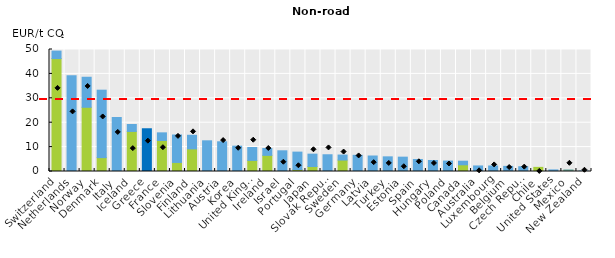
| Category | Average explicit carbon tax, 2018 | Average fuel excise tax, 2018 |
|---|---|---|
| Switzerland | 46.276 | 3.068 |
| Netherlands | 0 | 39.267 |
| Norway | 26.324 | 12.3 |
| Denmark | 5.682 | 27.645 |
| Italy | 0 | 22.139 |
| Iceland | 16.418 | 2.854 |
| Greece | 0 | 17.518 |
| France | 12.724 | 3.117 |
| Slovenia | 3.708 | 11.254 |
| Finland | 9.275 | 5.569 |
| Lithuania | 0 | 12.578 |
| Austria | 0 | 12.172 |
| Korea | 0 | 10.378 |
| United Kingdom | 4.543 | 5.284 |
| Ireland | 6.617 | 2.808 |
| Israel | 0 | 8.483 |
| Portugal | 0.823 | 7.122 |
| Japan | 2.029 | 5.081 |
| Slovak Republic | 0 | 6.864 |
| Sweden | 4.692 | 2.048 |
| Germany | 0 | 6.628 |
| Latvia | 0.146 | 6.205 |
| Turkey | 0 | 6.007 |
| Estonia | 0.062 | 5.816 |
| Spain | 0 | 4.929 |
| Hungary | 0 | 4.52 |
| Poland | 0 | 4.276 |
| Canada | 2.747 | 1.475 |
| Australia | 0 | 2.273 |
| Luxembourg | 0 | 2.259 |
| Belgium | 0 | 2.102 |
| Czech Republic | 0 | 1.952 |
| Chile | 1.69 | 0 |
| United States | 0 | 0.652 |
| Mexico | 0.55 | 0.035 |
| New Zealand | 0 | 0.199 |